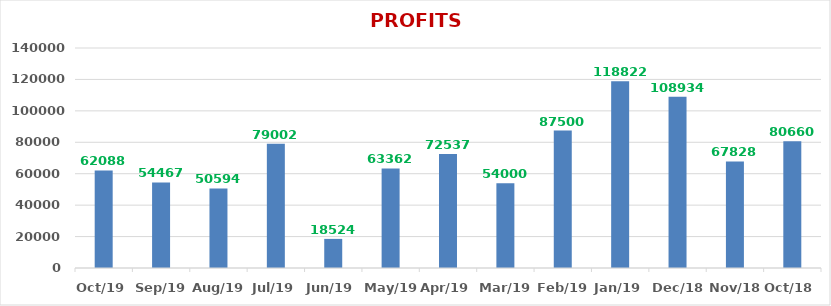
| Category | PROFITS (Rs.) |
|---|---|
| 2019-10-01 | 62088 |
| 2019-09-01 | 54467 |
| 2019-08-01 | 50594 |
| 2019-07-01 | 79002 |
| 2019-06-01 | 18524 |
| 2019-05-01 | 63362 |
| 2019-04-01 | 72537 |
| 2019-03-01 | 54000 |
| 2019-02-01 | 87500 |
| 2019-01-01 | 118822 |
| 2018-12-01 | 108934 |
| 2018-11-01 | 67828 |
| 2018-10-01 | 80660 |